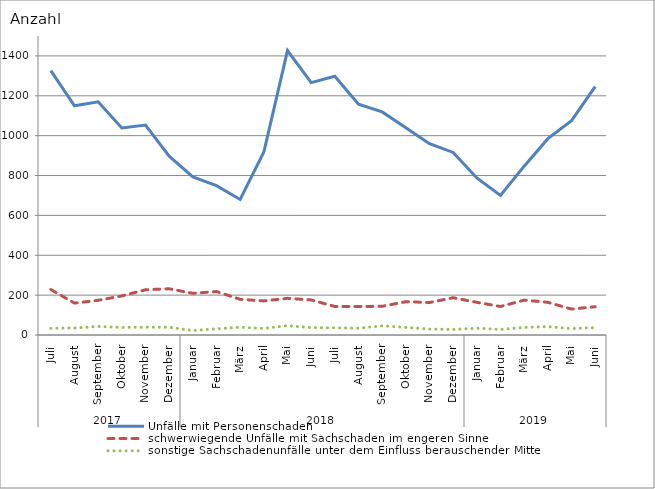
| Category | Unfälle mit Personenschaden | schwerwiegende Unfälle mit Sachschaden im engeren Sinne | sonstige Sachschadenunfälle unter dem Einfluss berauschender Mittel |
|---|---|---|---|
| 0 | 1326 | 228 | 34 |
| 1 | 1150 | 160 | 35 |
| 2 | 1170 | 174 | 43 |
| 3 | 1039 | 196 | 38 |
| 4 | 1053 | 227 | 39 |
| 5 | 897 | 232 | 39 |
| 6 | 793 | 209 | 22 |
| 7 | 749 | 218 | 31 |
| 8 | 680 | 179 | 39 |
| 9 | 918 | 171 | 33 |
| 10 | 1427 | 184 | 47 |
| 11 | 1266 | 176 | 37 |
| 12 | 1298 | 143 | 36 |
| 13 | 1158 | 143 | 34 |
| 14 | 1119 | 144 | 46 |
| 15 | 1040 | 167 | 38 |
| 16 | 960 | 163 | 30 |
| 17 | 916 | 187 | 28 |
| 18 | 788 | 164 | 34 |
| 19 | 700 | 143 | 28 |
| 20 | 847 | 175 | 38 |
| 21 | 985 | 164 | 42 |
| 22 | 1075 | 130 | 32 |
| 23 | 1246 | 142 | 37 |